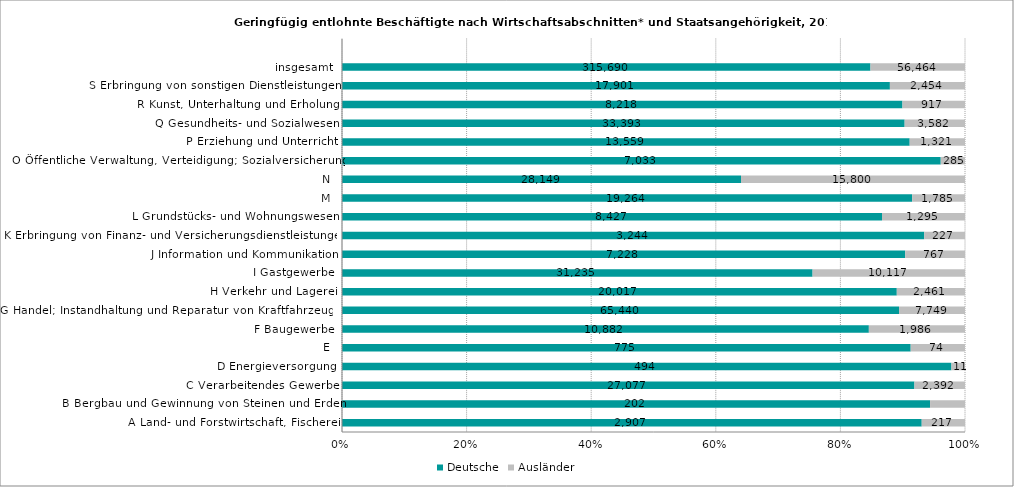
| Category | Deutsche | Ausländer |
|---|---|---|
| A Land- und Forstwirtschaft, Fischerei | 2907 | 217 |
| B Bergbau und Gewinnung von Steinen und Erden | 202 | 12 |
| C Verarbeitendes Gewerbe | 27077 | 2392 |
| D Energieversorgung | 494 | 11 |
| E | 775 | 74 |
| F Baugewerbe | 10882 | 1986 |
| G Handel; Instandhaltung und Reparatur von Kraftfahrzeugen | 65440 | 7749 |
| H Verkehr und Lagerei | 20017 | 2461 |
| I Gastgewerbe | 31235 | 10117 |
| J Information und Kommunikation | 7228 | 767 |
| K Erbringung von Finanz- und Versicherungsdienstleistungen | 3244 | 227 |
| L Grundstücks- und Wohnungswesen | 8427 | 1295 |
| M | 19264 | 1785 |
| N | 28149 | 15800 |
| O Öffentliche Verwaltung, Verteidigung; Sozialversicherung | 7033 | 285 |
| P Erziehung und Unterricht | 13559 | 1321 |
| Q Gesundheits- und Sozialwesen | 33393 | 3582 |
| R Kunst, Unterhaltung und Erholung | 8218 | 917 |
| S Erbringung von sonstigen Dienstleistungen | 17901 | 2454 |
| insgesamt | 315690 | 56464 |